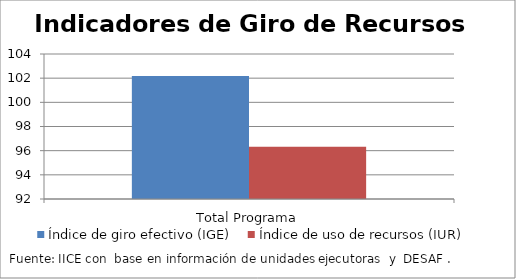
| Category | Índice de giro efectivo (IGE) | Índice de uso de recursos (IUR)  |
|---|---|---|
| Total Programa | 102.183 | 96.316 |